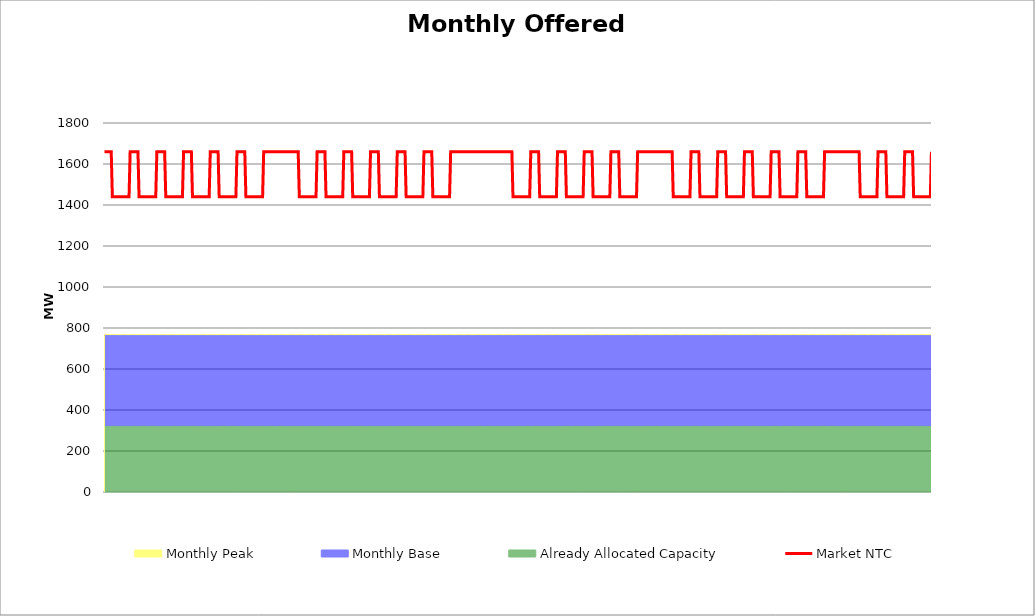
| Category | Market NTC |
|---|---|
| 0 | 1660 |
| 1 | 1660 |
| 2 | 1660 |
| 3 | 1660 |
| 4 | 1660 |
| 5 | 1660 |
| 6 | 1660 |
| 7 | 1440 |
| 8 | 1440 |
| 9 | 1440 |
| 10 | 1440 |
| 11 | 1440 |
| 12 | 1440 |
| 13 | 1440 |
| 14 | 1440 |
| 15 | 1440 |
| 16 | 1440 |
| 17 | 1440 |
| 18 | 1440 |
| 19 | 1440 |
| 20 | 1440 |
| 21 | 1440 |
| 22 | 1440 |
| 23 | 1660 |
| 24 | 1660 |
| 25 | 1660 |
| 26 | 1660 |
| 27 | 1660 |
| 28 | 1660 |
| 29 | 1660 |
| 30 | 1660 |
| 31 | 1440 |
| 32 | 1440 |
| 33 | 1440 |
| 34 | 1440 |
| 35 | 1440 |
| 36 | 1440 |
| 37 | 1440 |
| 38 | 1440 |
| 39 | 1440 |
| 40 | 1440 |
| 41 | 1440 |
| 42 | 1440 |
| 43 | 1440 |
| 44 | 1440 |
| 45 | 1440 |
| 46 | 1440 |
| 47 | 1660 |
| 48 | 1660 |
| 49 | 1660 |
| 50 | 1660 |
| 51 | 1660 |
| 52 | 1660 |
| 53 | 1660 |
| 54 | 1660 |
| 55 | 1440 |
| 56 | 1440 |
| 57 | 1440 |
| 58 | 1440 |
| 59 | 1440 |
| 60 | 1440 |
| 61 | 1440 |
| 62 | 1440 |
| 63 | 1440 |
| 64 | 1440 |
| 65 | 1440 |
| 66 | 1440 |
| 67 | 1440 |
| 68 | 1440 |
| 69 | 1440 |
| 70 | 1440 |
| 71 | 1660 |
| 72 | 1660 |
| 73 | 1660 |
| 74 | 1660 |
| 75 | 1660 |
| 76 | 1660 |
| 77 | 1660 |
| 78 | 1660 |
| 79 | 1440 |
| 80 | 1440 |
| 81 | 1440 |
| 82 | 1440 |
| 83 | 1440 |
| 84 | 1440 |
| 85 | 1440 |
| 86 | 1440 |
| 87 | 1440 |
| 88 | 1440 |
| 89 | 1440 |
| 90 | 1440 |
| 91 | 1440 |
| 92 | 1440 |
| 93 | 1440 |
| 94 | 1440 |
| 95 | 1660 |
| 96 | 1660 |
| 97 | 1660 |
| 98 | 1660 |
| 99 | 1660 |
| 100 | 1660 |
| 101 | 1660 |
| 102 | 1660 |
| 103 | 1440 |
| 104 | 1440 |
| 105 | 1440 |
| 106 | 1440 |
| 107 | 1440 |
| 108 | 1440 |
| 109 | 1440 |
| 110 | 1440 |
| 111 | 1440 |
| 112 | 1440 |
| 113 | 1440 |
| 114 | 1440 |
| 115 | 1440 |
| 116 | 1440 |
| 117 | 1440 |
| 118 | 1440 |
| 119 | 1660 |
| 120 | 1660 |
| 121 | 1660 |
| 122 | 1660 |
| 123 | 1660 |
| 124 | 1660 |
| 125 | 1660 |
| 126 | 1660 |
| 127 | 1440 |
| 128 | 1440 |
| 129 | 1440 |
| 130 | 1440 |
| 131 | 1440 |
| 132 | 1440 |
| 133 | 1440 |
| 134 | 1440 |
| 135 | 1440 |
| 136 | 1440 |
| 137 | 1440 |
| 138 | 1440 |
| 139 | 1440 |
| 140 | 1440 |
| 141 | 1440 |
| 142 | 1440 |
| 143 | 1660 |
| 144 | 1660 |
| 145 | 1660 |
| 146 | 1660 |
| 147 | 1660 |
| 148 | 1660 |
| 149 | 1660 |
| 150 | 1660 |
| 151 | 1660 |
| 152 | 1660 |
| 153 | 1660 |
| 154 | 1660 |
| 155 | 1660 |
| 156 | 1660 |
| 157 | 1660 |
| 158 | 1660 |
| 159 | 1660 |
| 160 | 1660 |
| 161 | 1660 |
| 162 | 1660 |
| 163 | 1660 |
| 164 | 1660 |
| 165 | 1660 |
| 166 | 1660 |
| 167 | 1660 |
| 168 | 1660 |
| 169 | 1660 |
| 170 | 1660 |
| 171 | 1660 |
| 172 | 1660 |
| 173 | 1660 |
| 174 | 1660 |
| 175 | 1440 |
| 176 | 1440 |
| 177 | 1440 |
| 178 | 1440 |
| 179 | 1440 |
| 180 | 1440 |
| 181 | 1440 |
| 182 | 1440 |
| 183 | 1440 |
| 184 | 1440 |
| 185 | 1440 |
| 186 | 1440 |
| 187 | 1440 |
| 188 | 1440 |
| 189 | 1440 |
| 190 | 1440 |
| 191 | 1660 |
| 192 | 1660 |
| 193 | 1660 |
| 194 | 1660 |
| 195 | 1660 |
| 196 | 1660 |
| 197 | 1660 |
| 198 | 1660 |
| 199 | 1440 |
| 200 | 1440 |
| 201 | 1440 |
| 202 | 1440 |
| 203 | 1440 |
| 204 | 1440 |
| 205 | 1440 |
| 206 | 1440 |
| 207 | 1440 |
| 208 | 1440 |
| 209 | 1440 |
| 210 | 1440 |
| 211 | 1440 |
| 212 | 1440 |
| 213 | 1440 |
| 214 | 1440 |
| 215 | 1660 |
| 216 | 1660 |
| 217 | 1660 |
| 218 | 1660 |
| 219 | 1660 |
| 220 | 1660 |
| 221 | 1660 |
| 222 | 1660 |
| 223 | 1440 |
| 224 | 1440 |
| 225 | 1440 |
| 226 | 1440 |
| 227 | 1440 |
| 228 | 1440 |
| 229 | 1440 |
| 230 | 1440 |
| 231 | 1440 |
| 232 | 1440 |
| 233 | 1440 |
| 234 | 1440 |
| 235 | 1440 |
| 236 | 1440 |
| 237 | 1440 |
| 238 | 1440 |
| 239 | 1660 |
| 240 | 1660 |
| 241 | 1660 |
| 242 | 1660 |
| 243 | 1660 |
| 244 | 1660 |
| 245 | 1660 |
| 246 | 1660 |
| 247 | 1440 |
| 248 | 1440 |
| 249 | 1440 |
| 250 | 1440 |
| 251 | 1440 |
| 252 | 1440 |
| 253 | 1440 |
| 254 | 1440 |
| 255 | 1440 |
| 256 | 1440 |
| 257 | 1440 |
| 258 | 1440 |
| 259 | 1440 |
| 260 | 1440 |
| 261 | 1440 |
| 262 | 1440 |
| 263 | 1660 |
| 264 | 1660 |
| 265 | 1660 |
| 266 | 1660 |
| 267 | 1660 |
| 268 | 1660 |
| 269 | 1660 |
| 270 | 1660 |
| 271 | 1440 |
| 272 | 1440 |
| 273 | 1440 |
| 274 | 1440 |
| 275 | 1440 |
| 276 | 1440 |
| 277 | 1440 |
| 278 | 1440 |
| 279 | 1440 |
| 280 | 1440 |
| 281 | 1440 |
| 282 | 1440 |
| 283 | 1440 |
| 284 | 1440 |
| 285 | 1440 |
| 286 | 1440 |
| 287 | 1660 |
| 288 | 1660 |
| 289 | 1660 |
| 290 | 1660 |
| 291 | 1660 |
| 292 | 1660 |
| 293 | 1660 |
| 294 | 1660 |
| 295 | 1440 |
| 296 | 1440 |
| 297 | 1440 |
| 298 | 1440 |
| 299 | 1440 |
| 300 | 1440 |
| 301 | 1440 |
| 302 | 1440 |
| 303 | 1440 |
| 304 | 1440 |
| 305 | 1440 |
| 306 | 1440 |
| 307 | 1440 |
| 308 | 1440 |
| 309 | 1440 |
| 310 | 1440 |
| 311 | 1660 |
| 312 | 1660 |
| 313 | 1660 |
| 314 | 1660 |
| 315 | 1660 |
| 316 | 1660 |
| 317 | 1660 |
| 318 | 1660 |
| 319 | 1660 |
| 320 | 1660 |
| 321 | 1660 |
| 322 | 1660 |
| 323 | 1660 |
| 324 | 1660 |
| 325 | 1660 |
| 326 | 1660 |
| 327 | 1660 |
| 328 | 1660 |
| 329 | 1660 |
| 330 | 1660 |
| 331 | 1660 |
| 332 | 1660 |
| 333 | 1660 |
| 334 | 1660 |
| 335 | 1660 |
| 336 | 1660 |
| 337 | 1660 |
| 338 | 1660 |
| 339 | 1660 |
| 340 | 1660 |
| 341 | 1660 |
| 342 | 1660 |
| 343 | 1660 |
| 344 | 1660 |
| 345 | 1660 |
| 346 | 1660 |
| 347 | 1660 |
| 348 | 1660 |
| 349 | 1660 |
| 350 | 1660 |
| 351 | 1660 |
| 352 | 1660 |
| 353 | 1660 |
| 354 | 1660 |
| 355 | 1660 |
| 356 | 1660 |
| 357 | 1660 |
| 358 | 1660 |
| 359 | 1660 |
| 360 | 1660 |
| 361 | 1660 |
| 362 | 1660 |
| 363 | 1660 |
| 364 | 1660 |
| 365 | 1660 |
| 366 | 1660 |
| 367 | 1440 |
| 368 | 1440 |
| 369 | 1440 |
| 370 | 1440 |
| 371 | 1440 |
| 372 | 1440 |
| 373 | 1440 |
| 374 | 1440 |
| 375 | 1440 |
| 376 | 1440 |
| 377 | 1440 |
| 378 | 1440 |
| 379 | 1440 |
| 380 | 1440 |
| 381 | 1440 |
| 382 | 1440 |
| 383 | 1660 |
| 384 | 1660 |
| 385 | 1660 |
| 386 | 1660 |
| 387 | 1660 |
| 388 | 1660 |
| 389 | 1660 |
| 390 | 1660 |
| 391 | 1440 |
| 392 | 1440 |
| 393 | 1440 |
| 394 | 1440 |
| 395 | 1440 |
| 396 | 1440 |
| 397 | 1440 |
| 398 | 1440 |
| 399 | 1440 |
| 400 | 1440 |
| 401 | 1440 |
| 402 | 1440 |
| 403 | 1440 |
| 404 | 1440 |
| 405 | 1440 |
| 406 | 1440 |
| 407 | 1660 |
| 408 | 1660 |
| 409 | 1660 |
| 410 | 1660 |
| 411 | 1660 |
| 412 | 1660 |
| 413 | 1660 |
| 414 | 1660 |
| 415 | 1440 |
| 416 | 1440 |
| 417 | 1440 |
| 418 | 1440 |
| 419 | 1440 |
| 420 | 1440 |
| 421 | 1440 |
| 422 | 1440 |
| 423 | 1440 |
| 424 | 1440 |
| 425 | 1440 |
| 426 | 1440 |
| 427 | 1440 |
| 428 | 1440 |
| 429 | 1440 |
| 430 | 1440 |
| 431 | 1660 |
| 432 | 1660 |
| 433 | 1660 |
| 434 | 1660 |
| 435 | 1660 |
| 436 | 1660 |
| 437 | 1660 |
| 438 | 1660 |
| 439 | 1440 |
| 440 | 1440 |
| 441 | 1440 |
| 442 | 1440 |
| 443 | 1440 |
| 444 | 1440 |
| 445 | 1440 |
| 446 | 1440 |
| 447 | 1440 |
| 448 | 1440 |
| 449 | 1440 |
| 450 | 1440 |
| 451 | 1440 |
| 452 | 1440 |
| 453 | 1440 |
| 454 | 1440 |
| 455 | 1660 |
| 456 | 1660 |
| 457 | 1660 |
| 458 | 1660 |
| 459 | 1660 |
| 460 | 1660 |
| 461 | 1660 |
| 462 | 1660 |
| 463 | 1440 |
| 464 | 1440 |
| 465 | 1440 |
| 466 | 1440 |
| 467 | 1440 |
| 468 | 1440 |
| 469 | 1440 |
| 470 | 1440 |
| 471 | 1440 |
| 472 | 1440 |
| 473 | 1440 |
| 474 | 1440 |
| 475 | 1440 |
| 476 | 1440 |
| 477 | 1440 |
| 478 | 1440 |
| 479 | 1660 |
| 480 | 1660 |
| 481 | 1660 |
| 482 | 1660 |
| 483 | 1660 |
| 484 | 1660 |
| 485 | 1660 |
| 486 | 1660 |
| 487 | 1660 |
| 488 | 1660 |
| 489 | 1660 |
| 490 | 1660 |
| 491 | 1660 |
| 492 | 1660 |
| 493 | 1660 |
| 494 | 1660 |
| 495 | 1660 |
| 496 | 1660 |
| 497 | 1660 |
| 498 | 1660 |
| 499 | 1660 |
| 500 | 1660 |
| 501 | 1660 |
| 502 | 1660 |
| 503 | 1660 |
| 504 | 1660 |
| 505 | 1660 |
| 506 | 1660 |
| 507 | 1660 |
| 508 | 1660 |
| 509 | 1660 |
| 510 | 1660 |
| 511 | 1440 |
| 512 | 1440 |
| 513 | 1440 |
| 514 | 1440 |
| 515 | 1440 |
| 516 | 1440 |
| 517 | 1440 |
| 518 | 1440 |
| 519 | 1440 |
| 520 | 1440 |
| 521 | 1440 |
| 522 | 1440 |
| 523 | 1440 |
| 524 | 1440 |
| 525 | 1440 |
| 526 | 1440 |
| 527 | 1660 |
| 528 | 1660 |
| 529 | 1660 |
| 530 | 1660 |
| 531 | 1660 |
| 532 | 1660 |
| 533 | 1660 |
| 534 | 1660 |
| 535 | 1440 |
| 536 | 1440 |
| 537 | 1440 |
| 538 | 1440 |
| 539 | 1440 |
| 540 | 1440 |
| 541 | 1440 |
| 542 | 1440 |
| 543 | 1440 |
| 544 | 1440 |
| 545 | 1440 |
| 546 | 1440 |
| 547 | 1440 |
| 548 | 1440 |
| 549 | 1440 |
| 550 | 1440 |
| 551 | 1660 |
| 552 | 1660 |
| 553 | 1660 |
| 554 | 1660 |
| 555 | 1660 |
| 556 | 1660 |
| 557 | 1660 |
| 558 | 1660 |
| 559 | 1440 |
| 560 | 1440 |
| 561 | 1440 |
| 562 | 1440 |
| 563 | 1440 |
| 564 | 1440 |
| 565 | 1440 |
| 566 | 1440 |
| 567 | 1440 |
| 568 | 1440 |
| 569 | 1440 |
| 570 | 1440 |
| 571 | 1440 |
| 572 | 1440 |
| 573 | 1440 |
| 574 | 1440 |
| 575 | 1660 |
| 576 | 1660 |
| 577 | 1660 |
| 578 | 1660 |
| 579 | 1660 |
| 580 | 1660 |
| 581 | 1660 |
| 582 | 1660 |
| 583 | 1440 |
| 584 | 1440 |
| 585 | 1440 |
| 586 | 1440 |
| 587 | 1440 |
| 588 | 1440 |
| 589 | 1440 |
| 590 | 1440 |
| 591 | 1440 |
| 592 | 1440 |
| 593 | 1440 |
| 594 | 1440 |
| 595 | 1440 |
| 596 | 1440 |
| 597 | 1440 |
| 598 | 1440 |
| 599 | 1660 |
| 600 | 1660 |
| 601 | 1660 |
| 602 | 1660 |
| 603 | 1660 |
| 604 | 1660 |
| 605 | 1660 |
| 606 | 1660 |
| 607 | 1440 |
| 608 | 1440 |
| 609 | 1440 |
| 610 | 1440 |
| 611 | 1440 |
| 612 | 1440 |
| 613 | 1440 |
| 614 | 1440 |
| 615 | 1440 |
| 616 | 1440 |
| 617 | 1440 |
| 618 | 1440 |
| 619 | 1440 |
| 620 | 1440 |
| 621 | 1440 |
| 622 | 1440 |
| 623 | 1660 |
| 624 | 1660 |
| 625 | 1660 |
| 626 | 1660 |
| 627 | 1660 |
| 628 | 1660 |
| 629 | 1660 |
| 630 | 1660 |
| 631 | 1440 |
| 632 | 1440 |
| 633 | 1440 |
| 634 | 1440 |
| 635 | 1440 |
| 636 | 1440 |
| 637 | 1440 |
| 638 | 1440 |
| 639 | 1440 |
| 640 | 1440 |
| 641 | 1440 |
| 642 | 1440 |
| 643 | 1440 |
| 644 | 1440 |
| 645 | 1440 |
| 646 | 1440 |
| 647 | 1660 |
| 648 | 1660 |
| 649 | 1660 |
| 650 | 1660 |
| 651 | 1660 |
| 652 | 1660 |
| 653 | 1660 |
| 654 | 1660 |
| 655 | 1660 |
| 656 | 1660 |
| 657 | 1660 |
| 658 | 1660 |
| 659 | 1660 |
| 660 | 1660 |
| 661 | 1660 |
| 662 | 1660 |
| 663 | 1660 |
| 664 | 1660 |
| 665 | 1660 |
| 666 | 1660 |
| 667 | 1660 |
| 668 | 1660 |
| 669 | 1660 |
| 670 | 1660 |
| 671 | 1660 |
| 672 | 1660 |
| 673 | 1660 |
| 674 | 1660 |
| 675 | 1660 |
| 676 | 1660 |
| 677 | 1660 |
| 678 | 1660 |
| 679 | 1440 |
| 680 | 1440 |
| 681 | 1440 |
| 682 | 1440 |
| 683 | 1440 |
| 684 | 1440 |
| 685 | 1440 |
| 686 | 1440 |
| 687 | 1440 |
| 688 | 1440 |
| 689 | 1440 |
| 690 | 1440 |
| 691 | 1440 |
| 692 | 1440 |
| 693 | 1440 |
| 694 | 1440 |
| 695 | 1660 |
| 696 | 1660 |
| 697 | 1660 |
| 698 | 1660 |
| 699 | 1660 |
| 700 | 1660 |
| 701 | 1660 |
| 702 | 1660 |
| 703 | 1440 |
| 704 | 1440 |
| 705 | 1440 |
| 706 | 1440 |
| 707 | 1440 |
| 708 | 1440 |
| 709 | 1440 |
| 710 | 1440 |
| 711 | 1440 |
| 712 | 1440 |
| 713 | 1440 |
| 714 | 1440 |
| 715 | 1440 |
| 716 | 1440 |
| 717 | 1440 |
| 718 | 1440 |
| 719 | 1660 |
| 720 | 1660 |
| 721 | 1660 |
| 722 | 1660 |
| 723 | 1660 |
| 724 | 1660 |
| 725 | 1660 |
| 726 | 1660 |
| 727 | 1440 |
| 728 | 1440 |
| 729 | 1440 |
| 730 | 1440 |
| 731 | 1440 |
| 732 | 1440 |
| 733 | 1440 |
| 734 | 1440 |
| 735 | 1440 |
| 736 | 1440 |
| 737 | 1440 |
| 738 | 1440 |
| 739 | 1440 |
| 740 | 1440 |
| 741 | 1440 |
| 742 | 1440 |
| 743 | 1660 |